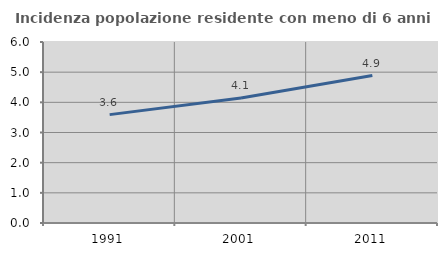
| Category | Incidenza popolazione residente con meno di 6 anni |
|---|---|
| 1991.0 | 3.593 |
| 2001.0 | 4.141 |
| 2011.0 | 4.887 |